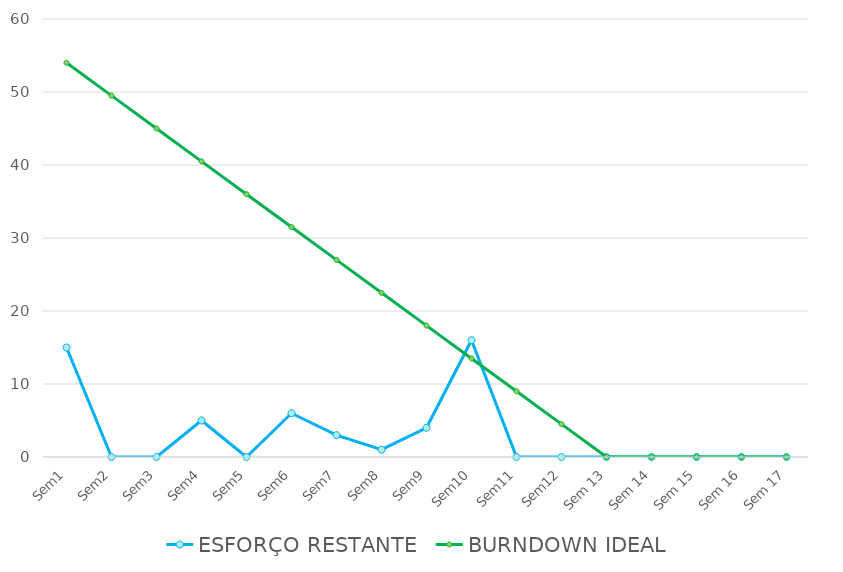
| Category | ESFORÇO RESTANTE | BURNDOWN IDEAL |
|---|---|---|
| Sem1 | 15 | 54 |
| Sem2 | 0 | 49.5 |
| Sem3 | 0 | 45 |
| Sem4 | 5 | 40.5 |
| Sem5 | 0 | 36 |
| Sem6 | 6 | 31.5 |
| Sem7 | 3 | 27 |
| Sem8 | 1 | 22.5 |
| Sem9 | 4 | 18 |
| Sem10 | 16 | 13.5 |
| Sem11 | 0 | 9 |
| Sem12 | 0 | 4.5 |
| Sem 13 | 0 | 0 |
| Sem 14 | 0 | 0 |
| Sem 15 | 0 | 0 |
| Sem 16 | 0 | 0 |
| Sem 17 | 0 | 0 |